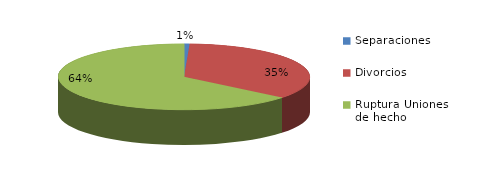
| Category | Series 0 |
|---|---|
| Separaciones | 34 |
| Divorcios | 1677 |
| Ruptura Uniones de hecho | 3061 |